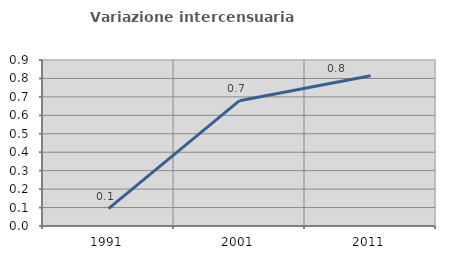
| Category | Variazione intercensuaria annua |
|---|---|
| 1991.0 | 0.094 |
| 2001.0 | 0.68 |
| 2011.0 | 0.814 |